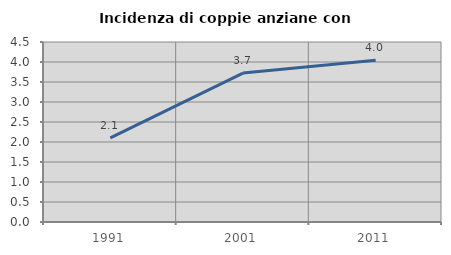
| Category | Incidenza di coppie anziane con figli |
|---|---|
| 1991.0 | 2.105 |
| 2001.0 | 3.723 |
| 2011.0 | 4.043 |